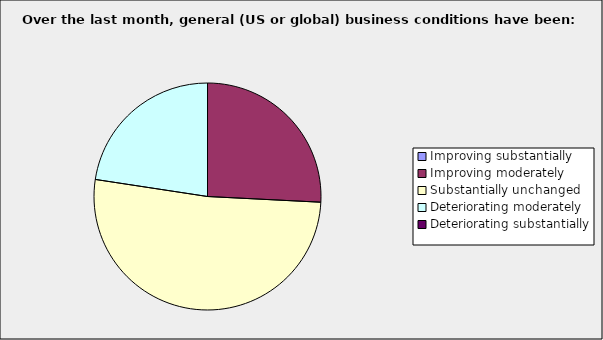
| Category | Series 0 |
|---|---|
| Improving substantially | 0 |
| Improving moderately | 0.258 |
| Substantially unchanged | 0.516 |
| Deteriorating moderately | 0.226 |
| Deteriorating substantially | 0 |